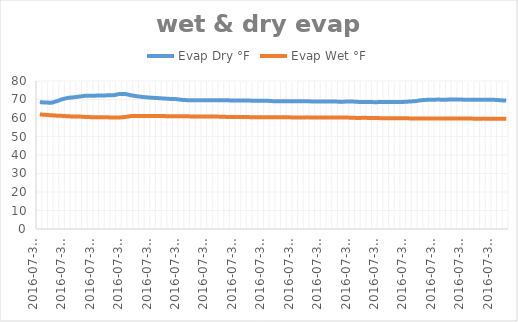
| Category | Evap Dry °F | Evap Wet °F |
|---|---|---|
| 2016-07-31 22:22:14 | 68.5 | 61.925 |
| 2016-07-31 22:22:24 | 68.4 | 61.7 |
| 2016-07-31 22:22:34 | 68.2 | 61.475 |
| 2016-07-31 22:22:44 | 69.1 | 61.25 |
| 2016-07-31 22:22:54 | 70.2 | 61.138 |
| 2016-07-31 22:23:04 | 70.9 | 60.912 |
| 2016-07-31 22:23:14 | 71.2 | 60.8 |
| 2016-07-31 22:23:24 | 71.6 | 60.8 |
| 2016-07-31 22:23:34 | 72 | 60.575 |
| 2016-07-31 22:23:44 | 72 | 60.462 |
| 2016-07-31 22:23:54 | 72.1 | 60.462 |
| 2016-07-31 22:24:04 | 72.1 | 60.35 |
| 2016-07-31 22:24:14 | 72.3 | 60.35 |
| 2016-07-31 22:24:24 | 72.3 | 60.238 |
| 2016-07-31 22:24:34 | 73 | 60.238 |
| 2016-07-31 22:24:44 | 73 | 60.575 |
| 2016-07-31 22:24:54 | 72.3 | 61.025 |
| 2016-07-31 22:25:04 | 71.8 | 61.138 |
| 2016-07-31 22:25:14 | 71.4 | 61.138 |
| 2016-07-31 22:25:24 | 71.1 | 61.138 |
| 2016-07-31 22:25:34 | 70.9 | 61.138 |
| 2016-07-31 22:25:44 | 70.7 | 61.025 |
| 2016-07-31 22:25:54 | 70.5 | 61.025 |
| 2016-07-31 22:26:04 | 70.3 | 60.912 |
| 2016-07-31 22:26:14 | 70.2 | 60.912 |
| 2016-07-31 22:26:24 | 69.8 | 60.912 |
| 2016-07-31 22:26:34 | 69.6 | 60.912 |
| 2016-07-31 22:26:44 | 69.6 | 60.8 |
| 2016-07-31 22:26:54 | 69.6 | 60.8 |
| 2016-07-31 22:27:04 | 69.6 | 60.8 |
| 2016-07-31 22:27:14 | 69.6 | 60.8 |
| 2016-07-31 22:27:24 | 69.6 | 60.8 |
| 2016-07-31 22:27:34 | 69.6 | 60.688 |
| 2016-07-31 22:27:44 | 69.6 | 60.575 |
| 2016-07-31 22:27:54 | 69.4 | 60.575 |
| 2016-07-31 22:28:04 | 69.4 | 60.575 |
| 2016-07-31 22:28:14 | 69.4 | 60.575 |
| 2016-07-31 22:28:24 | 69.4 | 60.462 |
| 2016-07-31 22:28:34 | 69.3 | 60.462 |
| 2016-07-31 22:28:44 | 69.3 | 60.462 |
| 2016-07-31 22:28:54 | 69.3 | 60.462 |
| 2016-07-31 22:29:04 | 69.1 | 60.35 |
| 2016-07-31 22:29:14 | 69.1 | 60.35 |
| 2016-07-31 22:29:24 | 69.1 | 60.35 |
| 2016-07-31 22:29:34 | 69.1 | 60.35 |
| 2016-07-31 22:29:44 | 69.1 | 60.238 |
| 2016-07-31 22:29:54 | 69.1 | 60.238 |
| 2016-07-31 22:30:04 | 69.1 | 60.35 |
| 2016-07-31 22:30:14 | 68.9 | 60.238 |
| 2016-07-31 22:30:24 | 68.9 | 60.238 |
| 2016-07-31 22:30:34 | 68.9 | 60.238 |
| 2016-07-31 22:30:44 | 68.9 | 60.238 |
| 2016-07-31 22:30:54 | 68.9 | 60.238 |
| 2016-07-31 22:31:04 | 68.7 | 60.238 |
| 2016-07-31 22:31:14 | 68.9 | 60.238 |
| 2016-07-31 22:31:24 | 68.9 | 60.125 |
| 2016-07-31 22:31:34 | 68.7 | 60.012 |
| 2016-07-31 22:31:44 | 68.7 | 60.125 |
| 2016-07-31 22:31:54 | 68.7 | 60.012 |
| 2016-07-31 22:32:04 | 68.5 | 60.012 |
| 2016-07-31 22:32:14 | 68.7 | 59.9 |
| 2016-07-31 22:32:24 | 68.7 | 59.9 |
| 2016-07-31 22:32:34 | 68.7 | 59.9 |
| 2016-07-31 22:32:44 | 68.7 | 59.9 |
| 2016-07-31 22:32:54 | 68.7 | 59.9 |
| 2016-07-31 22:33:04 | 68.9 | 59.788 |
| 2016-07-31 22:33:14 | 69.1 | 59.788 |
| 2016-07-31 22:33:24 | 69.6 | 59.788 |
| 2016-07-31 22:33:34 | 69.8 | 59.788 |
| 2016-07-31 22:33:44 | 69.8 | 59.788 |
| 2016-07-31 22:33:54 | 70 | 59.788 |
| 2016-07-31 22:34:04 | 69.8 | 59.788 |
| 2016-07-31 22:34:14 | 70 | 59.788 |
| 2016-07-31 22:34:24 | 70 | 59.675 |
| 2016-07-31 22:34:34 | 70 | 59.675 |
| 2016-07-31 22:34:44 | 69.8 | 59.675 |
| 2016-07-31 22:34:54 | 69.8 | 59.675 |
| 2016-07-31 22:35:04 | 69.8 | 59.562 |
| 2016-07-31 22:35:14 | 69.8 | 59.675 |
| 2016-07-31 22:35:24 | 69.8 | 59.562 |
| 2016-07-31 22:35:34 | 69.8 | 59.562 |
| 2016-07-31 22:35:44 | 69.6 | 59.562 |
| 2016-07-31 22:35:54 | 69.4 | 59.562 |